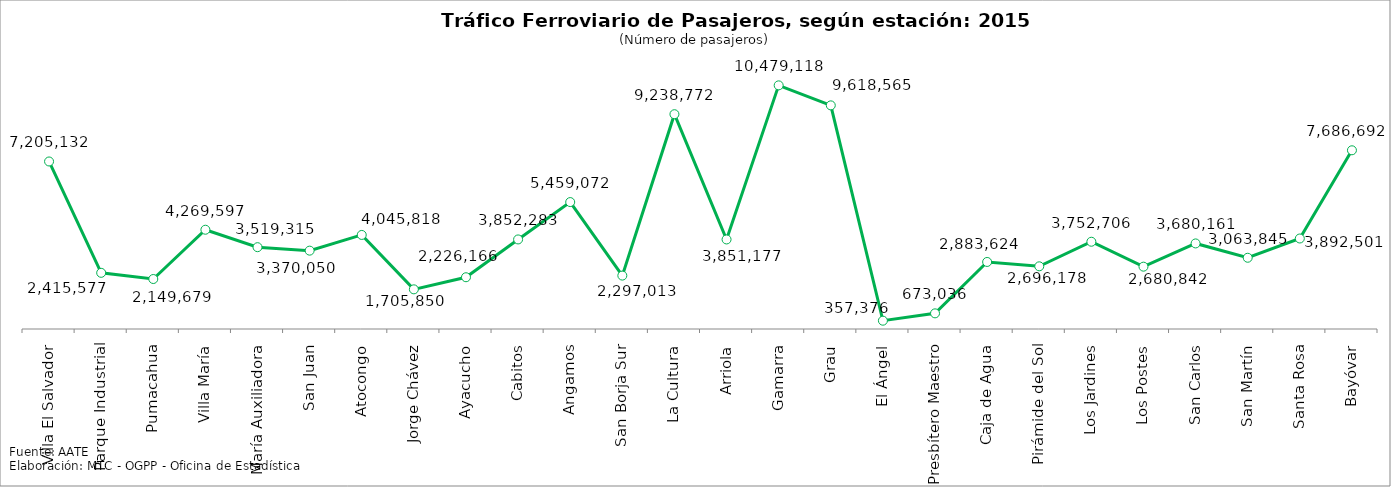
| Category | Series 0 |
|---|---|
| Villa El Salvador | 7205132 |
| Parque Industrial | 2415577 |
| Pumacahua | 2149679 |
| Villa María | 4269597 |
| María Auxiliadora | 3519315 |
| San Juan | 3370050 |
| Atocongo | 4045818 |
| Jorge Chávez | 1705850 |
| Ayacucho | 2226166 |
| Cabitos | 3852283 |
| Angamos | 5459072 |
| San Borja Sur | 2297013 |
| La Cultura | 9238772 |
| Arriola | 3851177 |
| Gamarra | 10479118 |
| Grau | 9618565 |
| El Ángel | 357376 |
| Presbítero Maestro | 673036 |
| Caja de Agua | 2883624 |
| Pirámide del Sol | 2696178 |
| Los Jardines | 3752706 |
| Los Postes | 2680842 |
| San Carlos | 3680161 |
| San Martín | 3063845 |
| Santa Rosa | 3892501 |
| Bayóvar | 7686692 |